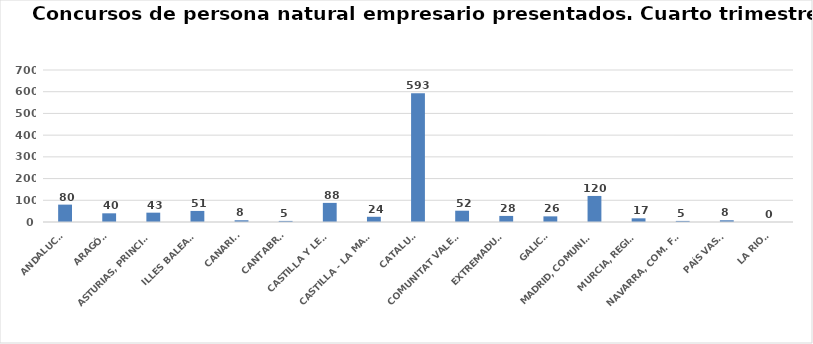
| Category | Series 0 |
|---|---|
| ANDALUCÍA | 80 |
| ARAGÓN | 40 |
| ASTURIAS, PRINCIPADO | 43 |
| ILLES BALEARS | 51 |
| CANARIAS | 8 |
| CANTABRIA | 5 |
| CASTILLA Y LEÓN | 88 |
| CASTILLA - LA MANCHA | 24 |
| CATALUÑA | 593 |
| COMUNITAT VALENCIANA | 52 |
| EXTREMADURA | 28 |
| GALICIA | 26 |
| MADRID, COMUNIDAD | 120 |
| MURCIA, REGIÓN | 17 |
| NAVARRA, COM. FORAL | 5 |
| PAÍS VASCO | 8 |
| LA RIOJA | 0 |